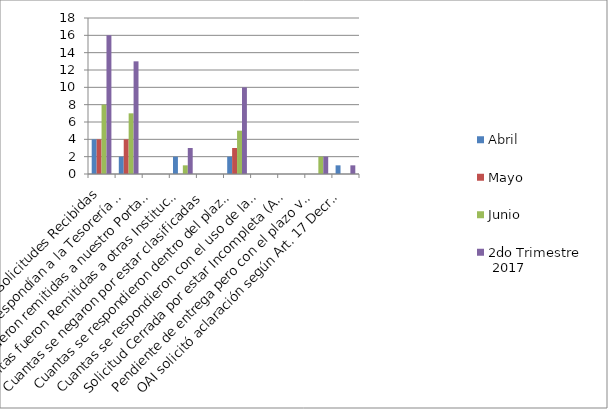
| Category | Abril | Mayo | Junio | 2do Trimestre
 2017 |
|---|---|---|---|---|
| Total de Solicitudes Recibidas | 4 | 4 | 8 | 16 |
| Cuantas le correspondían a la Tesorería Nacional | 2 | 4 | 7 | 13 |
| Cuantas fueron remitidas a nuestro Portal Web | 0 | 0 | 0 | 0 |
| Cuantas fueron Remitidas a otras Instituciones | 2 | 0 | 1 | 3 |
| Cuantas se negaron por estar clasificadas | 0 | 0 | 0 | 0 |
| Cuantas se respondieron dentro del plazo de los 15 días laborables | 2 | 3 | 5 | 10 |
| Cuantas se respondieron con el uso de la prórroga de 10 días | 0 | 0 | 0 | 0 |
| Solicitud Cerrada por estar Incompleta (Art. 17,Reglamento 130-05) | 0 | 0 | 0 | 0 |
| Pendiente de entrega pero con el plazo vigente | 0 | 0 | 2 | 2 |
| OAI solicitó aclaración según Art. 17 Decreto 130-05 | 1 | 0 | 0 | 1 |